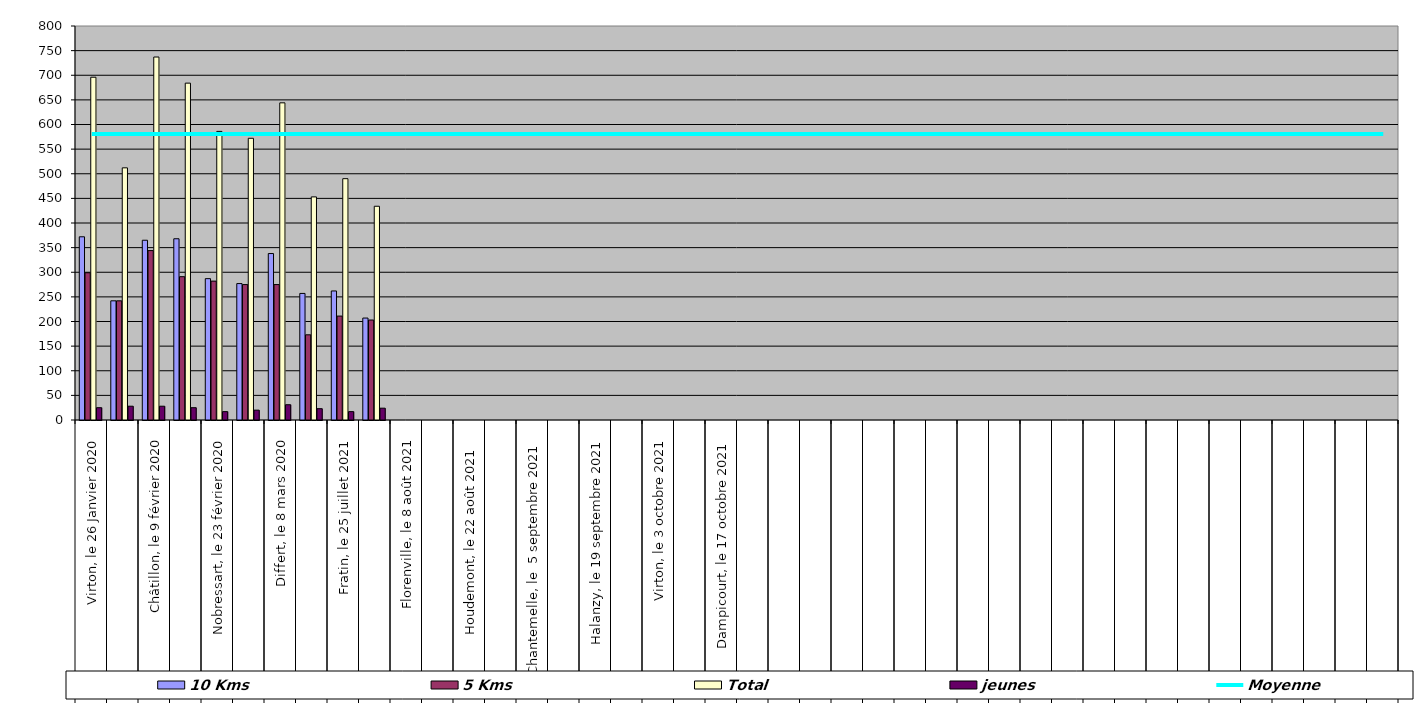
| Category | 10 Kms | 5 Kms | Total | jeunes |
|---|---|---|---|---|
| 0 | 372 | 299 | 696 | 25 |
| 1 | 242 | 242 | 512 | 28 |
| 2 | 365 | 344 | 737 | 28 |
| 3 | 368 | 291 | 684 | 25 |
| 4 | 287 | 282 | 586 | 17 |
| 5 | 277 | 275 | 572 | 20 |
| 6 | 338 | 275 | 644 | 31 |
| 7 | 257 | 173 | 453 | 23 |
| 8 | 262 | 211 | 490 | 17 |
| 9 | 207 | 203 | 434 | 24 |
| 10 | 0 | 0 | 0 | 0 |
| 11 | 0 | 0 | 0 | 0 |
| 12 | 0 | 0 | 0 | 0 |
| 13 | 0 | 0 | 0 | 0 |
| 14 | 0 | 0 | 0 | 0 |
| 15 | 0 | 0 | 0 | 0 |
| 16 | 0 | 0 | 0 | 0 |
| 17 | 0 | 0 | 0 | 0 |
| 18 | 0 | 0 | 0 | 0 |
| 19 | 0 | 0 | 0 | 0 |
| 20 | 0 | 0 | 0 | 0 |
| 21 | 0 | 0 | 0 | 0 |
| 22 | 0 | 0 | 0 | 0 |
| 23 | 0 | 0 | 0 | 0 |
| 24 | 0 | 0 | 0 | 0 |
| 25 | 0 | 0 | 0 | 0 |
| 26 | 0 | 0 | 0 | 0 |
| 27 | 0 | 0 | 0 | 0 |
| 28 | 0 | 0 | 0 | 0 |
| 29 | 0 | 0 | 0 | 0 |
| 30 | 0 | 0 | 0 | 0 |
| 31 | 0 | 0 | 0 | 0 |
| 32 | 0 | 0 | 0 | 0 |
| 33 | 0 | 0 | 0 | 0 |
| 34 | 0 | 0 | 0 | 0 |
| 35 | 0 | 0 | 0 | 0 |
| 36 | 0 | 0 | 0 | 0 |
| 37 | 0 | 0 | 0 | 0 |
| 38 | 0 | 0 | 0 | 0 |
| 39 | 0 | 0 | 0 | 0 |
| 40 | 0 | 0 | 0 | 0 |
| 41 | 0 | 0 | 0 | 0 |